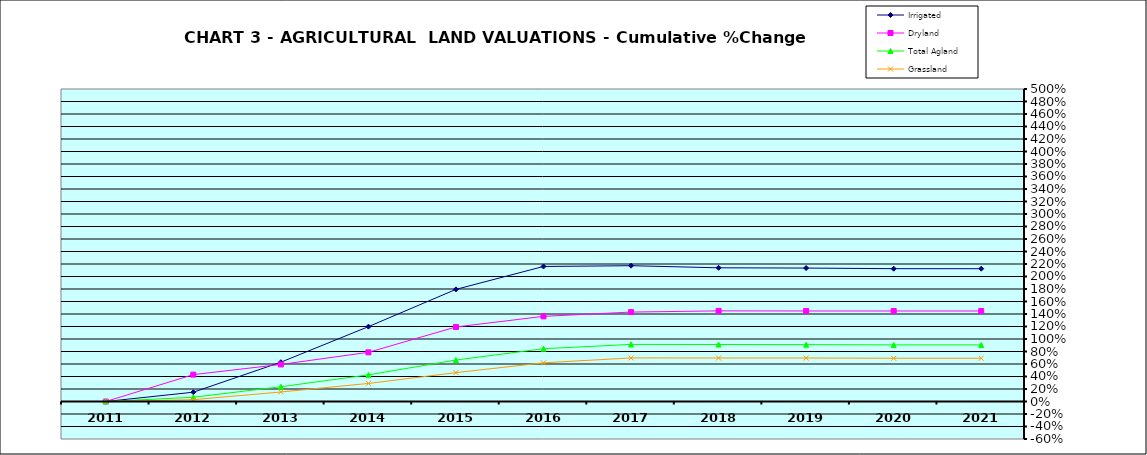
| Category | Irrigated | Dryland | Total Agland | Grassland |
|---|---|---|---|---|
| 2011.0 | 0 | 0 | 0 | 0 |
| 2012.0 | 0.149 | 0.43 | 0.068 | 0.029 |
| 2013.0 | 0.629 | 0.593 | 0.236 | 0.152 |
| 2014.0 | 1.198 | 0.787 | 0.426 | 0.289 |
| 2015.0 | 1.794 | 1.192 | 0.663 | 0.462 |
| 2016.0 | 2.16 | 1.362 | 0.845 | 0.619 |
| 2017.0 | 2.173 | 1.431 | 0.913 | 0.697 |
| 2018.0 | 2.139 | 1.45 | 0.912 | 0.696 |
| 2019.0 | 2.135 | 1.448 | 0.91 | 0.696 |
| 2020.0 | 2.125 | 1.448 | 0.906 | 0.692 |
| 2021.0 | 2.125 | 1.448 | 0.906 | 0.692 |